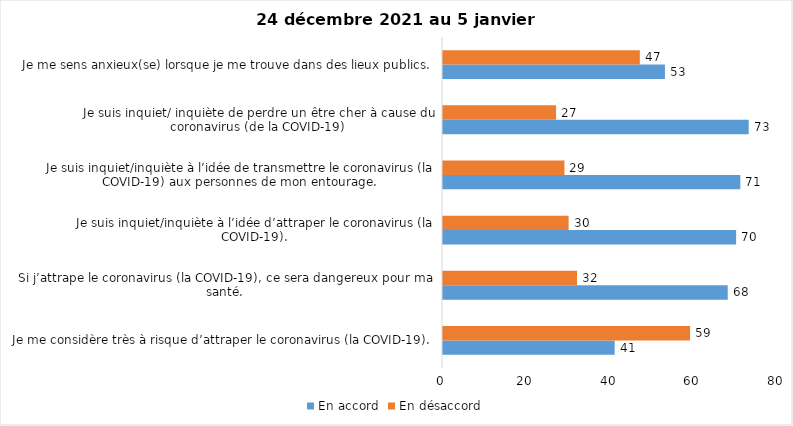
| Category | En accord | En désaccord |
|---|---|---|
| Je me considère très à risque d’attraper le coronavirus (la COVID-19). | 41 | 59 |
| Si j’attrape le coronavirus (la COVID-19), ce sera dangereux pour ma santé. | 68 | 32 |
| Je suis inquiet/inquiète à l’idée d’attraper le coronavirus (la COVID-19). | 70 | 30 |
| Je suis inquiet/inquiète à l’idée de transmettre le coronavirus (la COVID-19) aux personnes de mon entourage. | 71 | 29 |
| Je suis inquiet/ inquiète de perdre un être cher à cause du coronavirus (de la COVID-19) | 73 | 27 |
| Je me sens anxieux(se) lorsque je me trouve dans des lieux publics. | 53 | 47 |